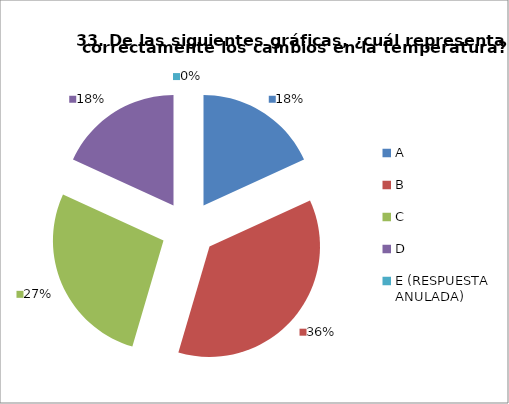
| Category | CANTIDAD DE RESPUESTAS PREGUNTA (33) | PORCENTAJE |
|---|---|---|
| A | 4 | 0.182 |
| B | 8 | 0.364 |
| C | 6 | 0.273 |
| D | 4 | 0.182 |
| E (RESPUESTA ANULADA) | 0 | 0 |